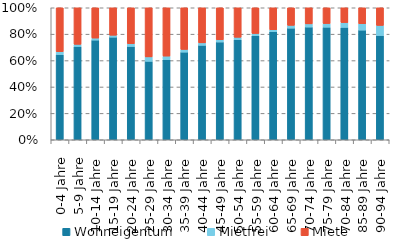
| Category | Wohneigentum | Mietfrei | Miete |
|---|---|---|---|
| 0-4 Jahre | 0.645 | 0.022 | 0.333 |
| 5-9 Jahre | 0.707 | 0.016 | 0.277 |
| 10-14 Jahre | 0.755 | 0.016 | 0.229 |
| 15-19 Jahre | 0.777 | 0.015 | 0.208 |
| 20-24 Jahre | 0.707 | 0.021 | 0.272 |
| 25-29 Jahre | 0.594 | 0.034 | 0.372 |
| 30-34 Jahre | 0.607 | 0.027 | 0.366 |
| 35-39 Jahre | 0.664 | 0.021 | 0.316 |
| 40-44 Jahre | 0.715 | 0.019 | 0.266 |
| 45-49 Jahre | 0.74 | 0.018 | 0.242 |
| 50-54 Jahre | 0.759 | 0.018 | 0.224 |
| 55-59 Jahre | 0.788 | 0.017 | 0.195 |
| 60-64 Jahre | 0.818 | 0.015 | 0.167 |
| 65-69 Jahre | 0.845 | 0.021 | 0.133 |
| 70-74 Jahre | 0.854 | 0.024 | 0.122 |
| 75-79 Jahre | 0.852 | 0.028 | 0.119 |
| 70-84 Jahre | 0.851 | 0.036 | 0.112 |
| 85-89 Jahre | 0.831 | 0.048 | 0.121 |
| 90-94 Jahre | 0.79 | 0.077 | 0.134 |